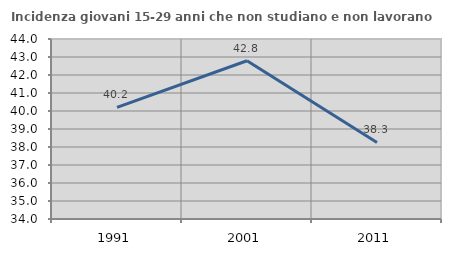
| Category | Incidenza giovani 15-29 anni che non studiano e non lavorano  |
|---|---|
| 1991.0 | 40.198 |
| 2001.0 | 42.79 |
| 2011.0 | 38.251 |